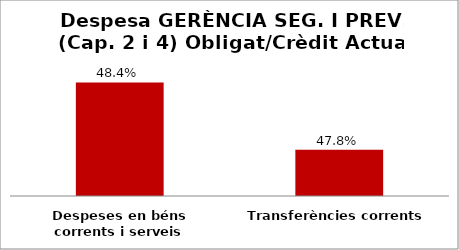
| Category | Series 0 |
|---|---|
| Despeses en béns corrents i serveis | 0.484 |
| Transferències corrents | 0.478 |